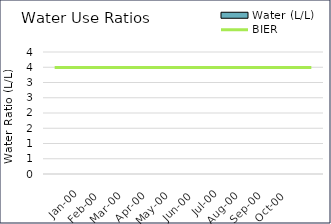
| Category | Water (L/L) |
|---|---|
| 0.0 | 0 |
| 1900-01-31 | 0 |
| 1900-02-28 | 0 |
| 1900-03-28 | 0 |
| 1900-04-28 | 0 |
| 1900-05-28 | 0 |
| 1900-06-28 | 0 |
| 1900-07-28 | 0 |
| 1900-08-28 | 0 |
| 1900-09-28 | 0 |
| 1900-10-28 | 0 |
| 1900-11-28 | 0 |